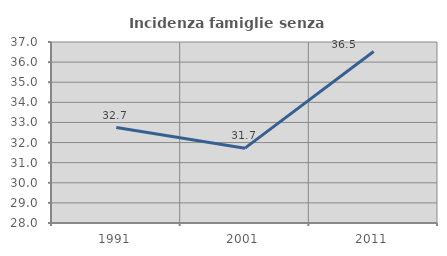
| Category | Incidenza famiglie senza nuclei |
|---|---|
| 1991.0 | 32.748 |
| 2001.0 | 31.721 |
| 2011.0 | 36.524 |